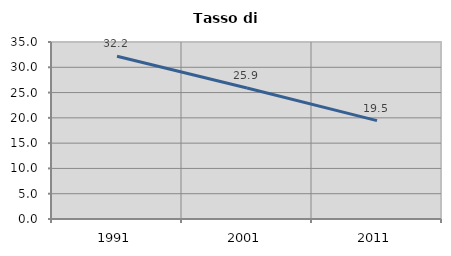
| Category | Tasso di disoccupazione   |
|---|---|
| 1991.0 | 32.167 |
| 2001.0 | 25.917 |
| 2011.0 | 19.459 |